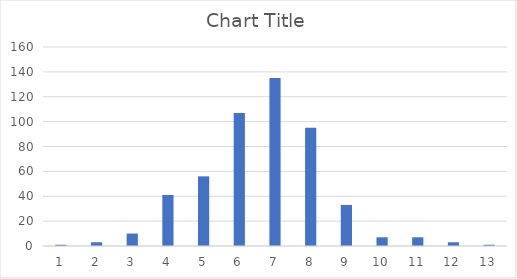
| Category | Series 0 |
|---|---|
| 0 | 1 |
| 1 | 3 |
| 2 | 10 |
| 3 | 41 |
| 4 | 56 |
| 5 | 107 |
| 6 | 135 |
| 7 | 95 |
| 8 | 33 |
| 9 | 7 |
| 10 | 7 |
| 11 | 3 |
| 12 | 1 |